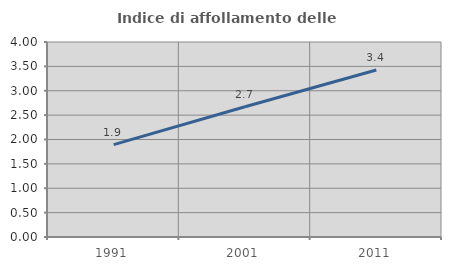
| Category | Indice di affollamento delle abitazioni  |
|---|---|
| 1991.0 | 1.894 |
| 2001.0 | 2.672 |
| 2011.0 | 3.427 |